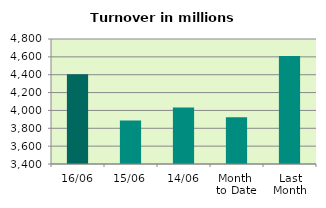
| Category | Series 0 |
|---|---|
| 16/06 | 4405.267 |
| 15/06 | 3888.584 |
| 14/06 | 4032.897 |
| Month 
to Date | 3923.868 |
| Last
Month | 4609.327 |